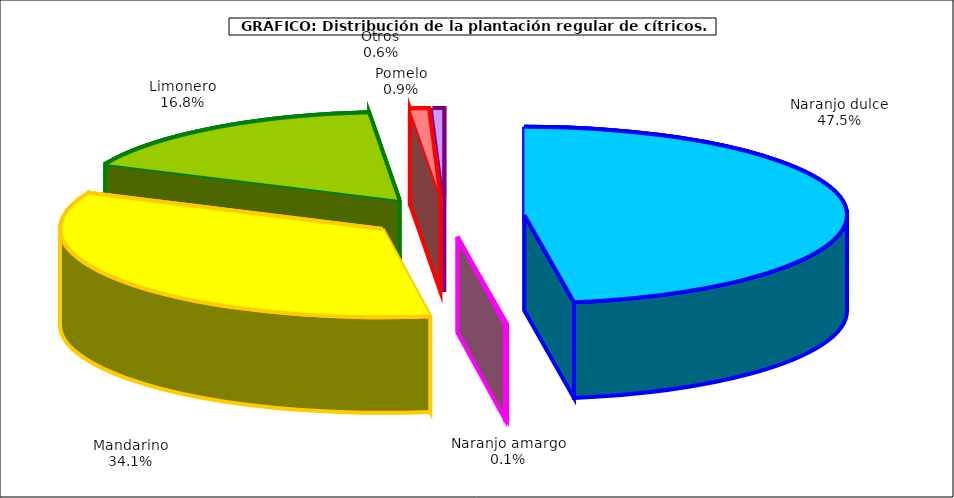
| Category | Series 0 |
|---|---|
| 0 | 142871 |
| 1 | 302 |
| 2 | 102384 |
| 3 | 50412 |
| 4 | 2831 |
| 5 | 1704 |